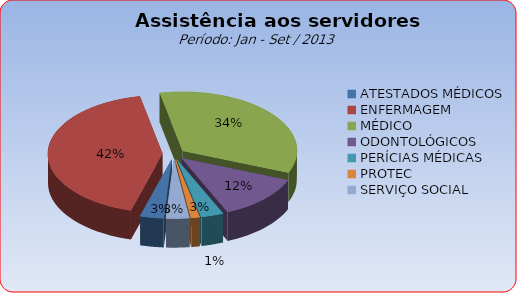
| Category | Series 0 |
|---|---|
| ATESTADOS MÉDICOS | 3.318 |
| ENFERMAGEM | 42.392 |
| MÉDICO | 34.271 |
| ODONTOLÓGICOS | 12.34 |
| PERÍCIAS MÉDICAS | 3.176 |
| PROTEC | 1.232 |
| SERVIÇO SOCIAL | 3.271 |